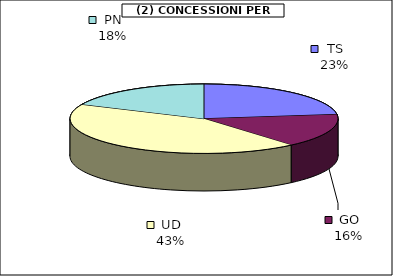
| Category | Series 0 |
|---|---|
| TS | 40682.5 |
| GO | 27811 |
| UD | 76108.35 |
| PN | 32204.5 |